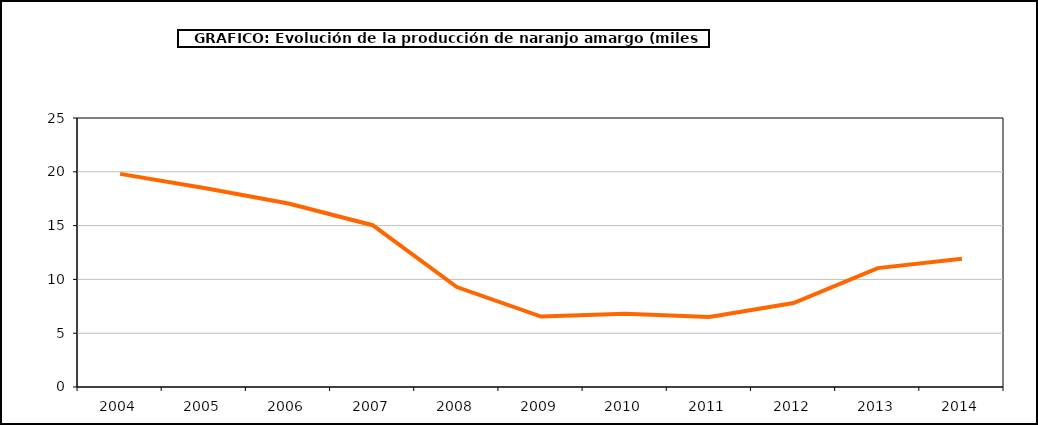
| Category | producción |
|---|---|
| 2004.0 | 19.807 |
| 2005.0 | 18.489 |
| 2006.0 | 17.057 |
| 2007.0 | 15.038 |
| 2008.0 | 9.287 |
| 2009.0 | 6.545 |
| 2010.0 | 6.81 |
| 2011.0 | 6.501 |
| 2012.0 | 7.798 |
| 2013.0 | 11.051 |
| 2014.0 | 11.915 |